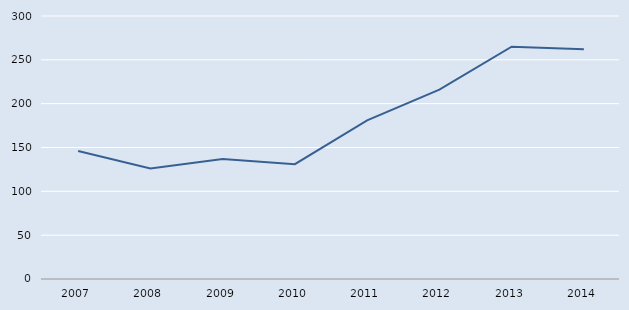
| Category | Series 0 |
|---|---|
| 2007.0 | 146 |
| 2008.0 | 126 |
| 2009.0 | 137 |
| 2010.0 | 131 |
| 2011.0 | 181 |
| 2012.0 | 216 |
| 2013.0 | 265 |
| 2014.0 | 262 |